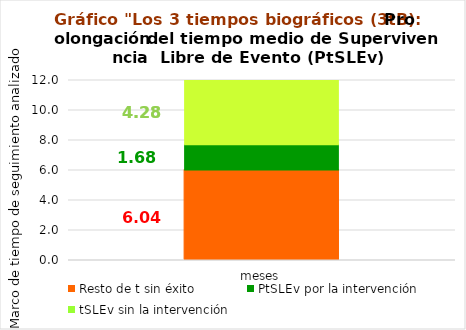
| Category | Resto de t sin éxito | PtSLEv por la intervención | tSLEv sin la intervención |
|---|---|---|---|
| meses | 6.041 | 1.678 | 4.282 |